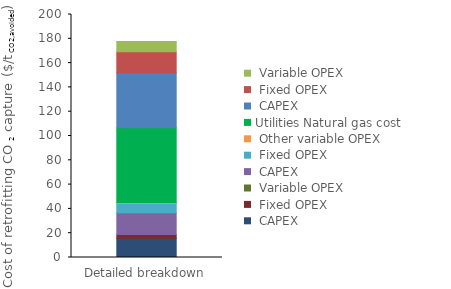
| Category | Interconnecting | Utilities | Series 0 | Series 1 | Series 2 |
|---|---|---|---|---|---|
| 0 | 0 | 61.44 | 45.463 | 17.276 | 8.329 |